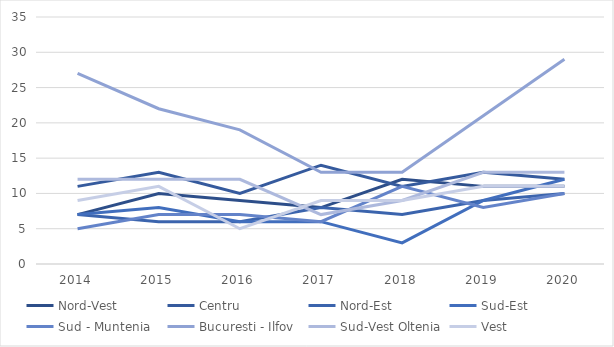
| Category | Nord-Vest | Centru | Nord-Est | Sud-Est | Sud - Muntenia | Bucuresti - Ilfov | Sud-Vest Oltenia | Vest |
|---|---|---|---|---|---|---|---|---|
| 2014 | 7 | 11 | 7 | 7 | 5 | 27 | 12 | 9 |
| 2015 | 10 | 13 | 6 | 8 | 7 | 22 | 12 | 11 |
| 2016 | 9 | 10 | 6 | 6 | 7 | 19 | 12 | 5 |
| 2017 | 8 | 14 | 8 | 6 | 6 | 13 | 7 | 9 |
| 2018 | 12 | 11 | 7 | 3 | 11 | 13 | 9 | 9 |
| 2019 | 11 | 13 | 9 | 9 | 8 | 21 | 13 | 11 |
| 2020 | 11 | 12 | 10 | 12 | 10 | 29 | 13 | 11 |